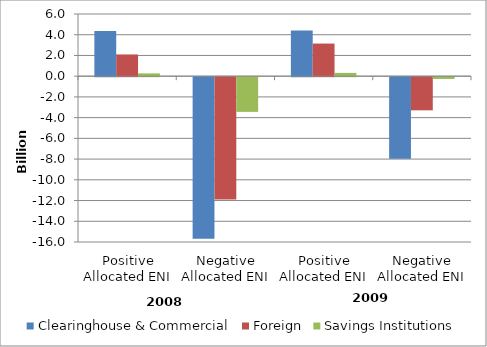
| Category | Clearinghouse & Commercial | Foreign | Savings Institutions |
|---|---|---|---|
| Positive Allocated ENI | 4349439598 | 2095025220 | 270737127 |
| Negative Allocated ENI | -15583315136 | -11807974482 | -3347638000 |
| Positive Allocated ENI | 4419656361 | 3146937241 | 318266348 |
| Negative Allocated ENI | -7879844440 | -3198514157 | -170983511 |